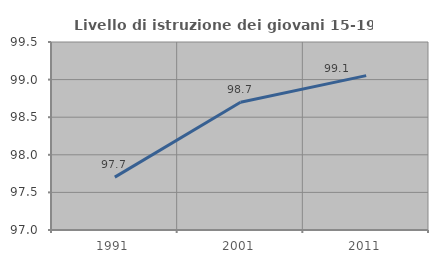
| Category | Livello di istruzione dei giovani 15-19 anni |
|---|---|
| 1991.0 | 97.703 |
| 2001.0 | 98.698 |
| 2011.0 | 99.053 |